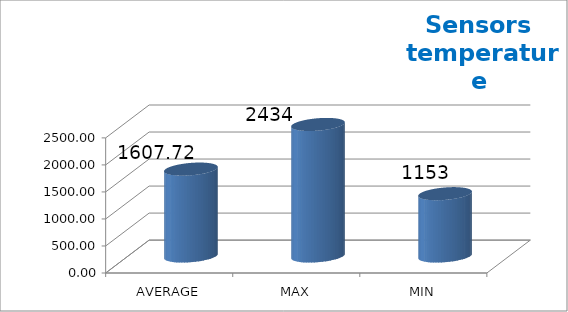
| Category | Series 0 |
|---|---|
| AVERAGE | 1607.717 |
| MAX | 2434 |
| MIN | 1153 |